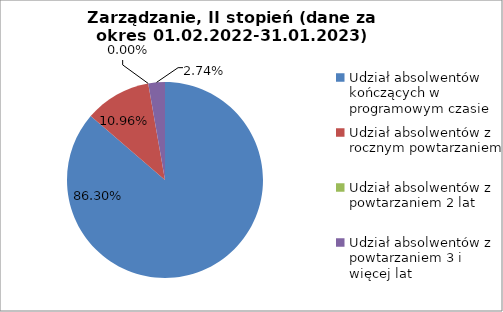
| Category | Series 0 |
|---|---|
| Udział absolwentów kończących w programowym czasie | 86.301 |
| Udział absolwentów z rocznym powtarzaniem | 10.959 |
| Udział absolwentów z powtarzaniem 2 lat | 0 |
| Udział absolwentów z powtarzaniem 3 i więcej lat | 2.74 |